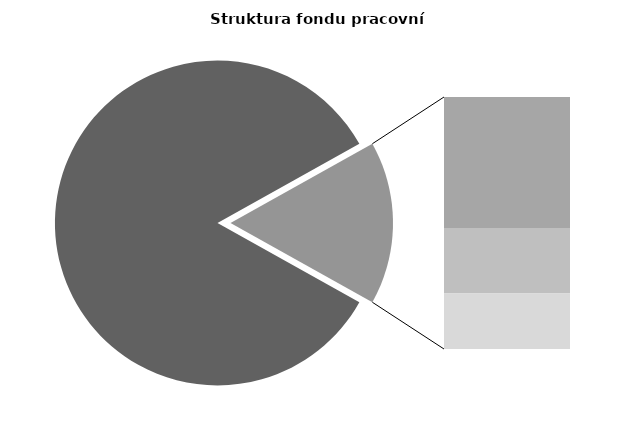
| Category | Series 0 |
|---|---|
| Průměrná měsíční odpracovaná doba bez přesčasu | 141.166 |
| Dovolená | 14.201 |
| Nemoc | 7.098 |
| Jiné | 6.027 |